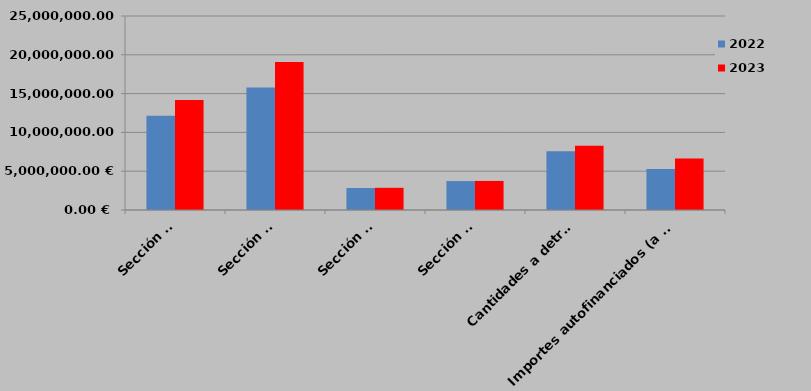
| Category | 2022 | 2023 |
|---|---|---|
| Sección 1ª | 12157700.557 | 14171068.84 |
| Sección 2ª | 15774491.71 | 19078529.47 |
| Sección 3ª | 2830558.25 | 2859060 |
| Sección 4ª | 3728485 | 3748643 |
| Cantidades a detraer | 7561873 | 8294412.354 |
| Importes autofinanciados (a deducir) | 5287262.19 | 6633055.17 |